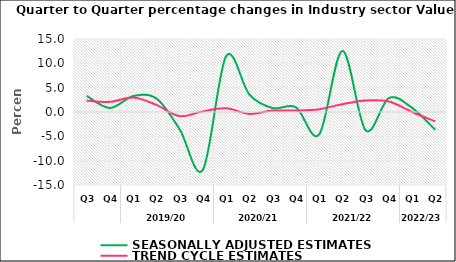
| Category | SEASONALLY ADJUSTED ESTIMATES | TREND CYCLE ESTIMATES |
|---|---|---|
| 0 | 3.319 | 2.365 |
| 1 | 0.827 | 2.087 |
| 2 | 3.265 | 2.979 |
| 3 | 2.764 | 1.47 |
| 4 | -3.538 | -0.835 |
| 5 | -11.864 | 0.131 |
| 6 | 11.472 | 0.749 |
| 7 | 3.59 | -0.387 |
| 8 | 0.801 | 0.291 |
| 9 | 0.974 | 0.304 |
| 10 | -4.628 | 0.575 |
| 11 | 12.549 | 1.611 |
| 12 | -3.754 | 2.385 |
| 13 | 2.871 | 2.14 |
| 14 | 0.844 | 0.007 |
| 15 | -3.674 | -1.941 |